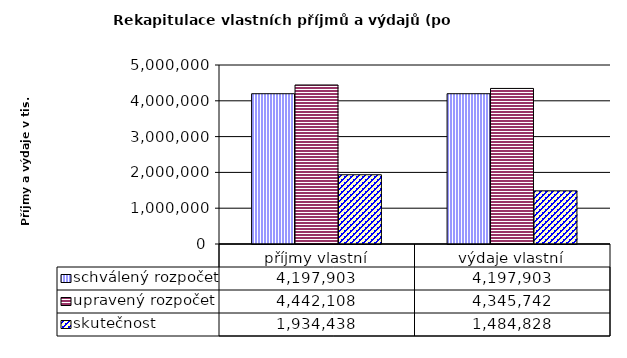
| Category | schválený rozpočet | upravený rozpočet | skutečnost |
|---|---|---|---|
| příjmy vlastní | 4197903 | 4442108 | 1934438 |
| výdaje vlastní | 4197903 | 4345742 | 1484828 |